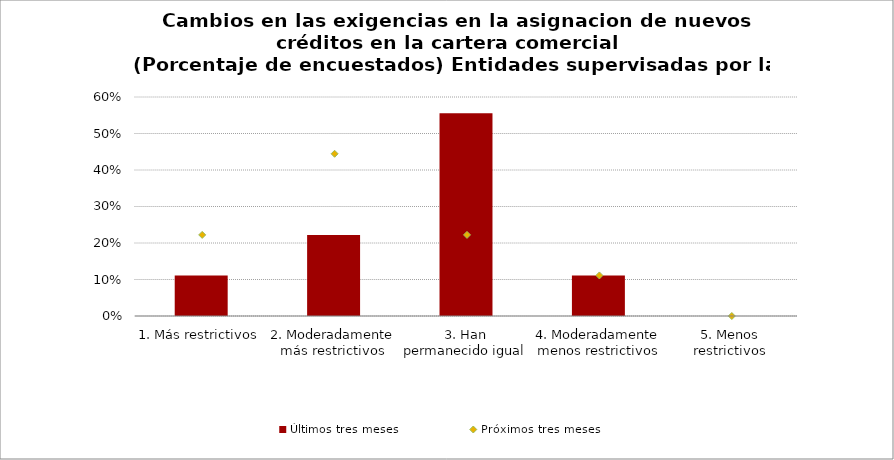
| Category | Últimos tres meses |
|---|---|
| 1. Más restrictivos | 0.111 |
| 2. Moderadamente más restrictivos | 0.222 |
| 3. Han permanecido igual | 0.556 |
| 4. Moderadamente menos restrictivos | 0.111 |
| 5. Menos restrictivos | 0 |